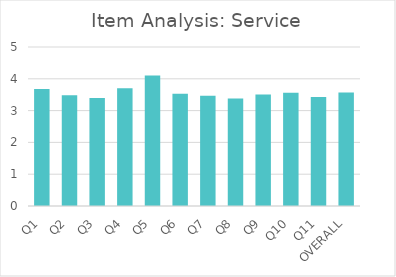
| Category | Series 0 |
|---|---|
| Q1 | 3.68 |
| Q2 | 3.48 |
| Q3 | 3.4 |
| Q4 | 3.7 |
| Q5 | 4.1 |
| Q6 | 3.53 |
| Q7 | 3.47 |
| Q8 | 3.38 |
| Q9 | 3.51 |
| Q10 | 3.56 |
| Q11 | 3.43 |
| OVERALL | 3.57 |